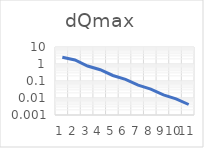
| Category | Series 0 |
|---|---|
| 0 | 2.5 |
| 1 | 1.722 |
| 2 | 0.761 |
| 3 | 0.461 |
| 4 | 0.211 |
| 5 | 0.124 |
| 6 | 0.057 |
| 7 | 0.033 |
| 8 | 0.015 |
| 9 | 0.009 |
| 10 | 0.004 |